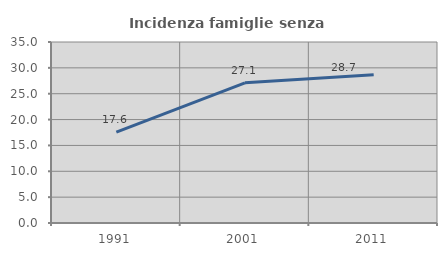
| Category | Incidenza famiglie senza nuclei |
|---|---|
| 1991.0 | 17.573 |
| 2001.0 | 27.104 |
| 2011.0 | 28.675 |